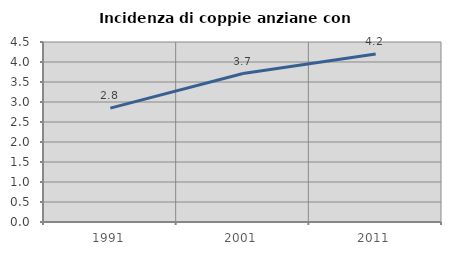
| Category | Incidenza di coppie anziane con figli |
|---|---|
| 1991.0 | 2.847 |
| 2001.0 | 3.712 |
| 2011.0 | 4.2 |